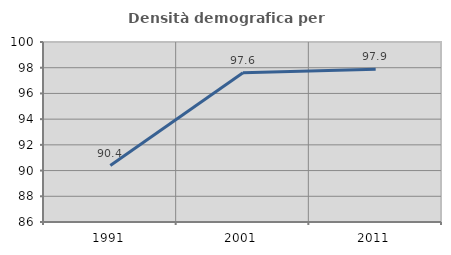
| Category | Densità demografica |
|---|---|
| 1991.0 | 90.394 |
| 2001.0 | 97.613 |
| 2011.0 | 97.878 |